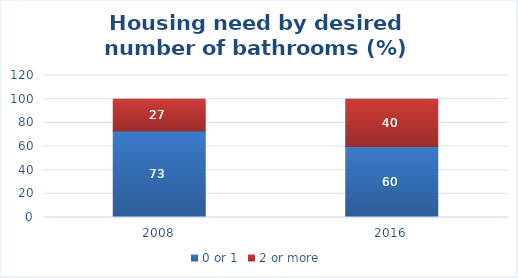
| Category | 0 or 1 | 2 or more  |
|---|---|---|
| 2008.0 | 73 | 27 |
| 2016.0 | 60 | 40 |